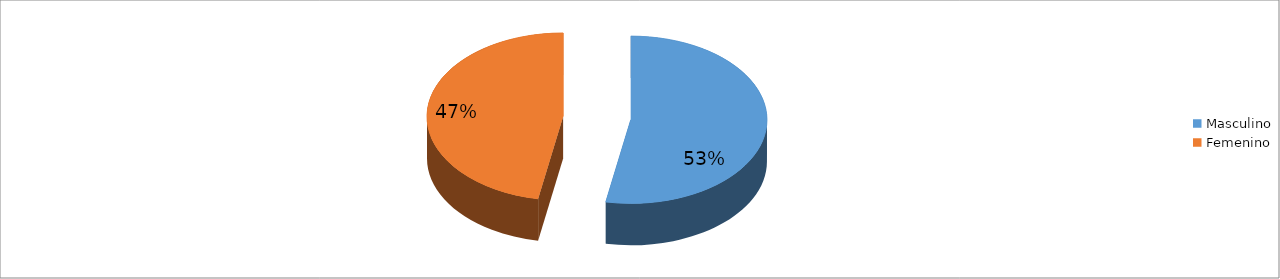
| Category | Series 0 |
|---|---|
| Masculino | 0.529 |
| Femenino | 0.471 |